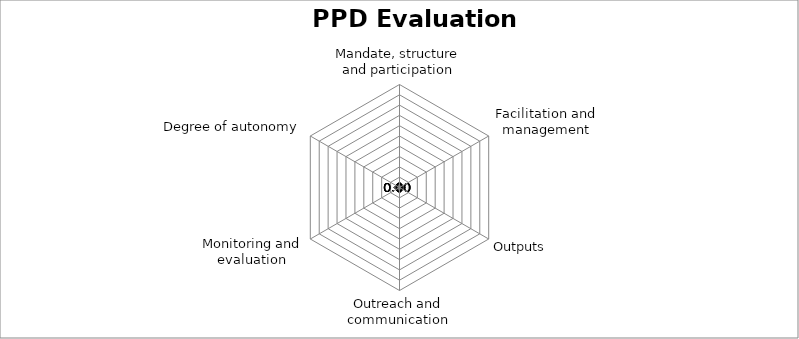
| Category | Series 0 |
|---|---|
| Mandate, structure and participation | 0 |
| Facilitation and management | 0 |
| Outputs | 0 |
| Outreach and communication | 0 |
| Monitoring and evaluation | 0 |
| Degree of autonomy | 0 |